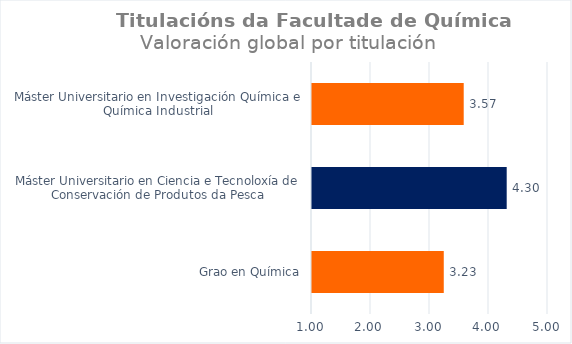
| Category | Series 0 |
|---|---|
| Grao en Química | 3.233 |
| Máster Universitario en Ciencia e Tecnoloxía de Conservación de Produtos da Pesca | 4.3 |
| Máster Universitario en Investigación Química e Química Industrial | 3.571 |